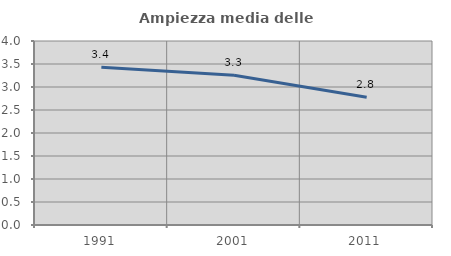
| Category | Ampiezza media delle famiglie |
|---|---|
| 1991.0 | 3.43 |
| 2001.0 | 3.254 |
| 2011.0 | 2.779 |